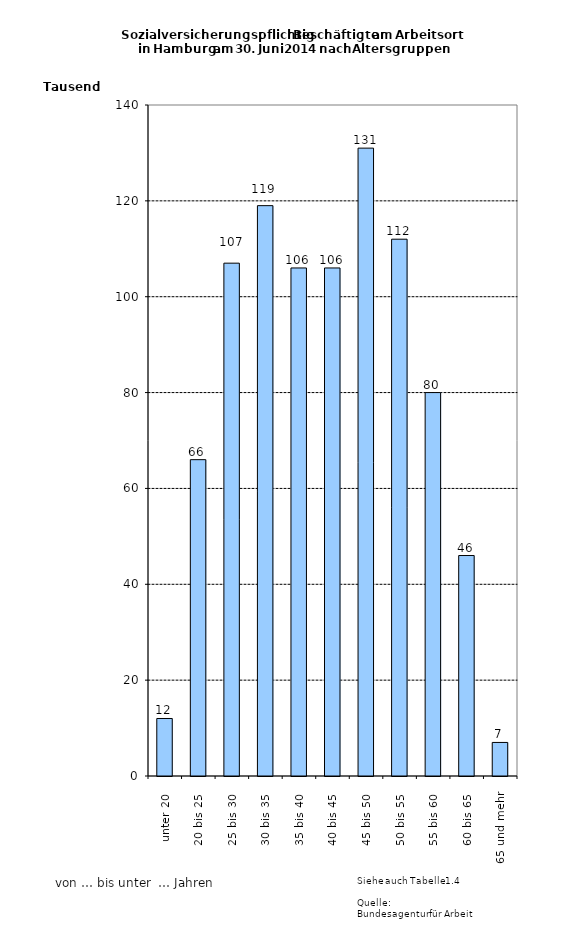
| Category | Series 0 |
|---|---|
| unter 20 | 12000 |
| 20 bis 25 | 66000 |
| 25 bis 30 | 107000 |
| 30 bis 35 | 119000 |
| 35 bis 40 | 106000 |
| 40 bis 45 | 106000 |
| 45 bis 50 | 131000 |
| 50 bis 55 | 112000 |
| 55 bis 60 | 80000 |
| 60 bis 65 | 46000 |
| 65 und mehr | 7000 |